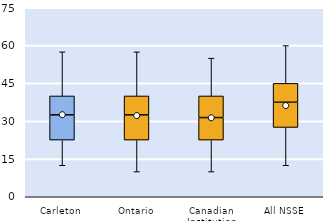
| Category | 25th | 50th | 75th |
|---|---|---|---|
| Carleton | 22.5 | 10 | 7.5 |
| Ontario | 22.5 | 10 | 7.5 |
| Canadian Institution | 22.5 | 8.929 | 8.571 |
| All NSSE | 27.5 | 10 | 7.5 |